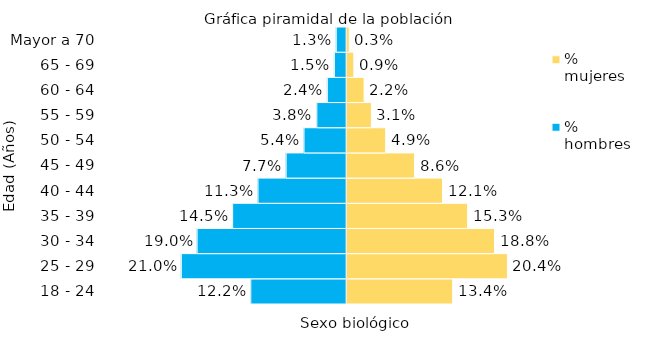
| Category | % hombres | % mujeres |
|---|---|---|
| 18 - 24 | -0.122 | 0.134 |
| 25 - 29 | -0.21 | 0.204 |
| 30 - 34 | -0.19 | 0.188 |
| 35 - 39 | -0.145 | 0.153 |
| 40 - 44 | -0.113 | 0.121 |
| 45 - 49 | -0.077 | 0.086 |
| 50 - 54 | -0.054 | 0.049 |
| 55 - 59 | -0.038 | 0.031 |
| 60 - 64 | -0.024 | 0.022 |
| 65 - 69 | -0.015 | 0.009 |
| Mayor a 70 | -0.013 | 0.003 |